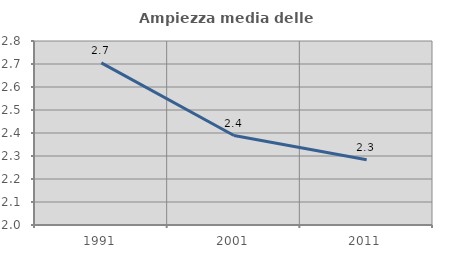
| Category | Ampiezza media delle famiglie |
|---|---|
| 1991.0 | 2.705 |
| 2001.0 | 2.389 |
| 2011.0 | 2.284 |